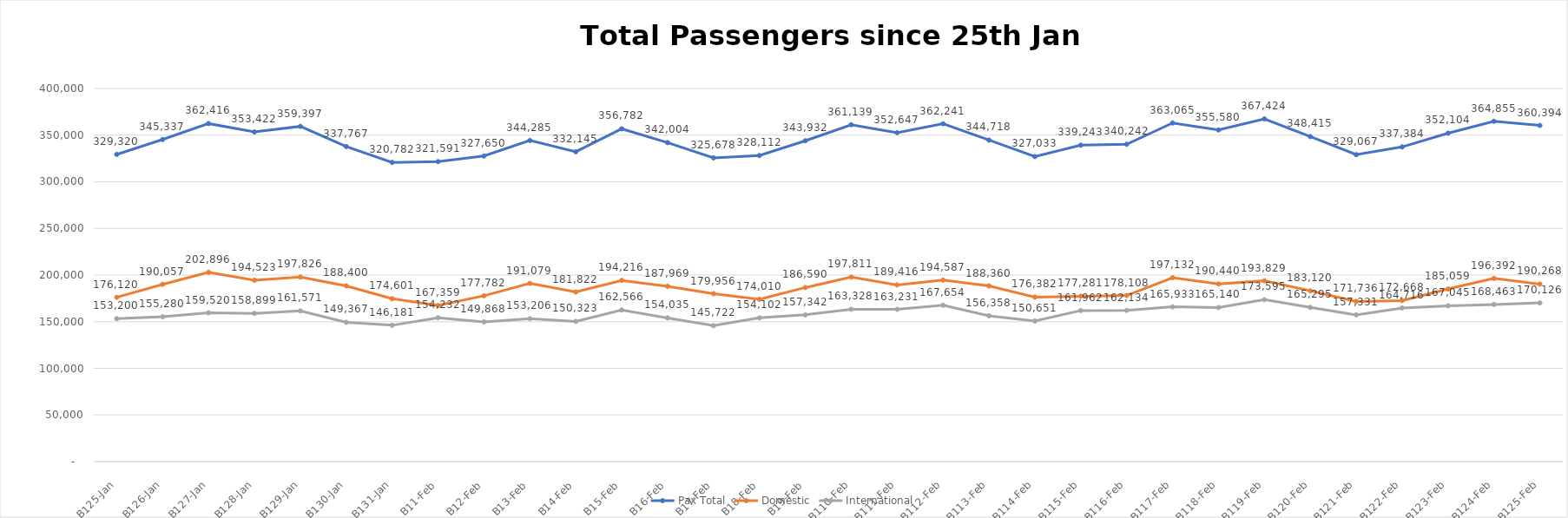
| Category | Pax Total |  Domestic  |  International  |
|---|---|---|---|
| 2023-01-25 | 329320 | 176120 | 153200 |
| 2023-01-26 | 345337 | 190057 | 155280 |
| 2023-01-27 | 362416 | 202896 | 159520 |
| 2023-01-28 | 353422 | 194523 | 158899 |
| 2023-01-29 | 359397 | 197826 | 161571 |
| 2023-01-30 | 337767 | 188400 | 149367 |
| 2023-01-31 | 320782 | 174601 | 146181 |
| 2023-02-01 | 321591 | 167359 | 154232 |
| 2023-02-02 | 327650 | 177782 | 149868 |
| 2023-02-03 | 344285 | 191079 | 153206 |
| 2023-02-04 | 332145 | 181822 | 150323 |
| 2023-02-05 | 356782 | 194216 | 162566 |
| 2023-02-06 | 342004 | 187969 | 154035 |
| 2023-02-07 | 325678 | 179956 | 145722 |
| 2023-02-08 | 328112 | 174010 | 154102 |
| 2023-02-09 | 343932 | 186590 | 157342 |
| 2023-02-10 | 361139 | 197811 | 163328 |
| 2023-02-11 | 352647 | 189416 | 163231 |
| 2023-02-12 | 362241 | 194587 | 167654 |
| 2023-02-13 | 344718 | 188360 | 156358 |
| 2023-02-14 | 327033 | 176382 | 150651 |
| 2023-02-15 | 339243 | 177281 | 161962 |
| 2023-02-16 | 340242 | 178108 | 162134 |
| 2023-02-17 | 363065 | 197132 | 165933 |
| 2023-02-18 | 355580 | 190440 | 165140 |
| 2023-02-19 | 367424 | 193829 | 173595 |
| 2023-02-20 | 348415 | 183120 | 165295 |
| 2023-02-21 | 329067 | 171736 | 157331 |
| 2023-02-22 | 337384 | 172668 | 164716 |
| 2023-02-23 | 352104 | 185059 | 167045 |
| 2023-02-24 | 364855 | 196392 | 168463 |
| 2023-02-25 | 360394 | 190268 | 170126 |